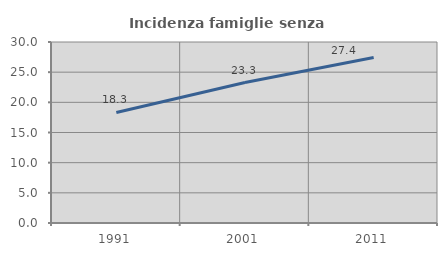
| Category | Incidenza famiglie senza nuclei |
|---|---|
| 1991.0 | 18.319 |
| 2001.0 | 23.278 |
| 2011.0 | 27.421 |